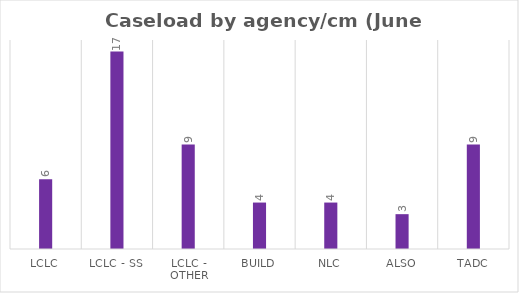
| Category | Series 0 |
|---|---|
| LCLC | 6 |
| LCLC - SS | 17 |
| LCLC - Other | 9 |
| BUILD | 4 |
| NLC | 4 |
| ALSO | 3 |
| TADC | 9 |